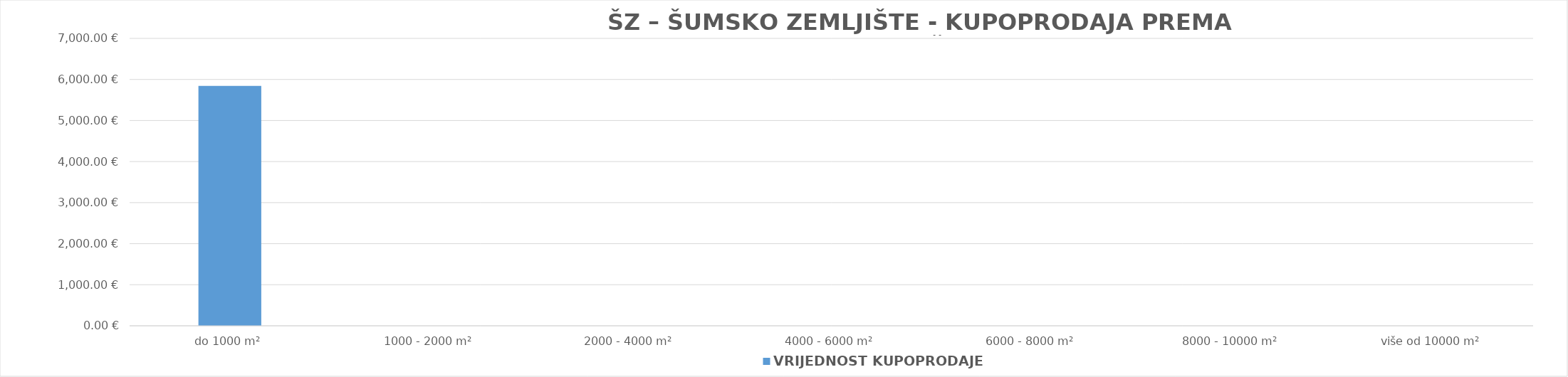
| Category | VRIJEDNOST KUPOPRODAJE 
(u EUR) |
|---|---|
| do 1000 m² | 5842.169 |
| 1000 - 2000 m² | 0 |
| 2000 - 4000 m² | 0 |
| 4000 - 6000 m² | 0 |
| 6000 - 8000 m² | 0 |
| 8000 - 10000 m² | 0 |
| više od 10000 m² | 0 |